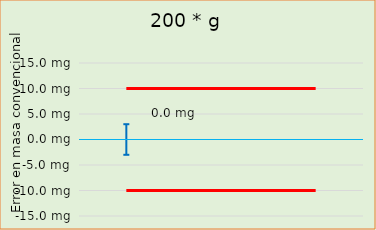
| Category | Error en masa convencional  |  ± EMP |
|---|---|---|
| 0 |  | -10 |
| 1 |  | -10 |
| 2 |  | -10 |